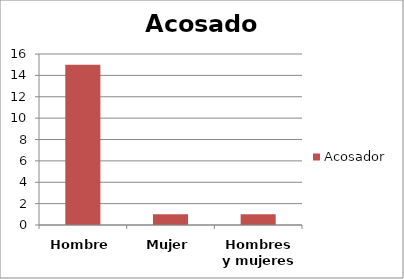
| Category | Acosador |
|---|---|
| Hombre | 15 |
| Mujer | 1 |
| Hombres y mujeres | 1 |